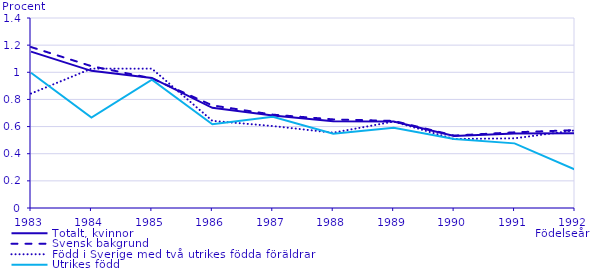
| Category | Totalt, kvinnor | Svensk bakgrund | Född i Sverige med två utrikes födda föräldrar | Utrikes född |
|---|---|---|---|---|
| 1983 | 1.153 | 1.186 | 0.843 | 0.997 |
| 1984 | 1.011 | 1.045 | 1.027 | 0.667 |
| 1985 | 0.958 | 0.955 | 1.027 | 0.946 |
| 1986 | 0.738 | 0.756 | 0.642 | 0.617 |
| 1987 | 0.682 | 0.688 | 0.604 | 0.672 |
| 1988 | 0.639 | 0.653 | 0.555 | 0.547 |
| 1989 | 0.637 | 0.642 | 0.637 | 0.59 |
| 1990 | 0.53 | 0.534 | 0.509 | 0.508 |
| 1991 | 0.548 | 0.558 | 0.513 | 0.476 |
| 1992 | 0.552 | 0.574 | 0.572 | 0.283 |